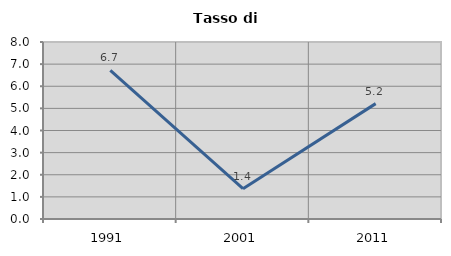
| Category | Tasso di disoccupazione   |
|---|---|
| 1991.0 | 6.718 |
| 2001.0 | 1.37 |
| 2011.0 | 5.215 |